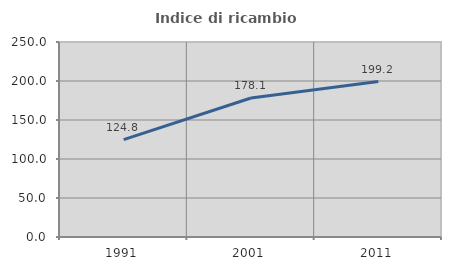
| Category | Indice di ricambio occupazionale  |
|---|---|
| 1991.0 | 124.807 |
| 2001.0 | 178.148 |
| 2011.0 | 199.242 |